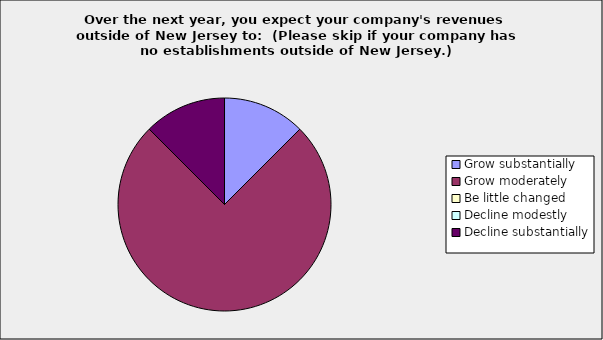
| Category | Series 0 |
|---|---|
| Grow substantially | 0.125 |
| Grow moderately | 0.75 |
| Be little changed | 0 |
| Decline modestly | 0 |
| Decline substantially | 0.125 |